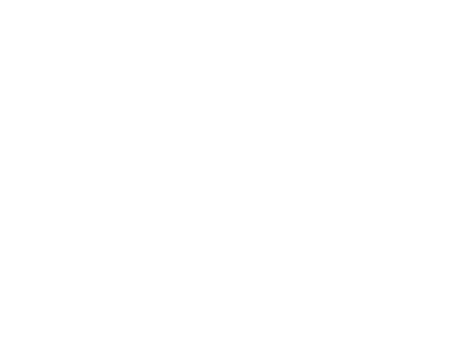
| Category | קרן ששולמה | ריבית ששולמה |
|---|---|---|
| 2019 | 316.351 | 226.28 |
| 2020 | 1105.769 | 739.178 |
| 2021 | 1939.715 | 1207.547 |
| 2022 | 2820.703 | 1628.874 |
| 2023 | 3751.386 | 2000.507 |
| 2024 | 4734.566 | 2319.642 |
| 2025 | 5773.206 | 2583.318 |
| 2026 | 6870.433 | 2788.406 |
| 2027 | 8029.552 | 2931.602 |
| 2028 | 9254.054 | 3009.415 |
| 2029 | 10000 | 3023.153 |